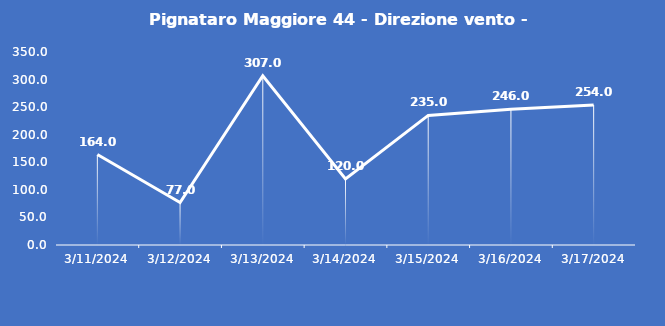
| Category | Pignataro Maggiore 44 - Direzione vento - Grezzo (°N) |
|---|---|
| 3/11/24 | 164 |
| 3/12/24 | 77 |
| 3/13/24 | 307 |
| 3/14/24 | 120 |
| 3/15/24 | 235 |
| 3/16/24 | 246 |
| 3/17/24 | 254 |